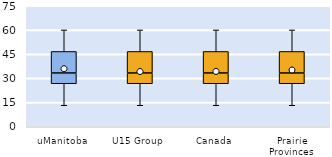
| Category | 25th | 50th | 75th |
|---|---|---|---|
| uManitoba | 26.667 | 6.667 | 13.333 |
| U15 Group | 26.667 | 6.667 | 13.333 |
| Canada | 26.667 | 6.667 | 13.333 |
| Prairie Provinces | 26.667 | 6.667 | 13.333 |